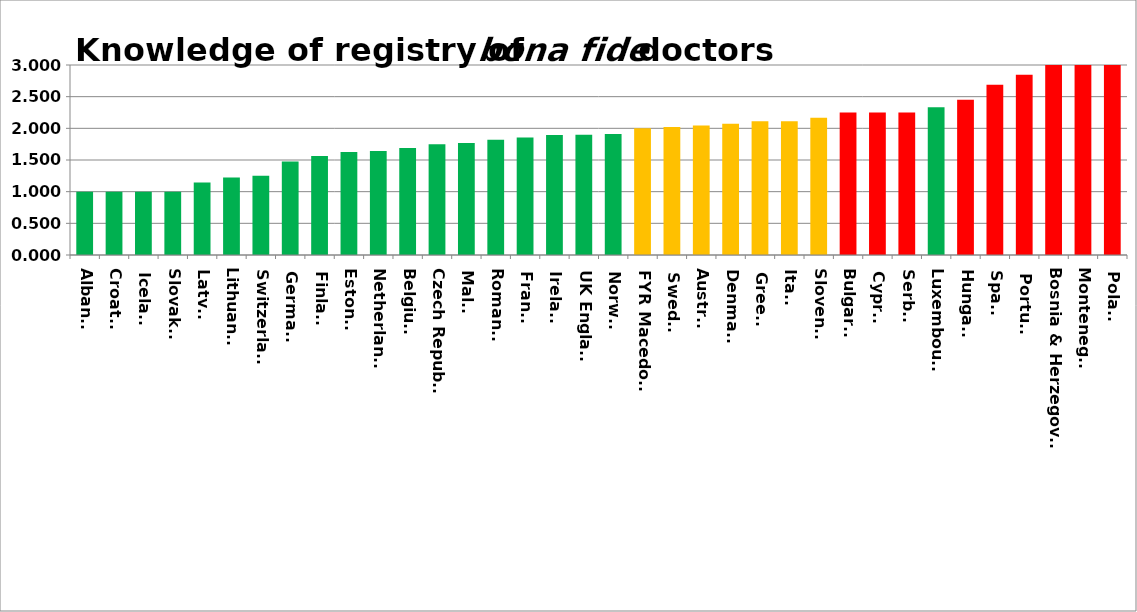
| Category | Series 0 |
|---|---|
| Albania | 1 |
| Croatia | 1 |
| Iceland | 1 |
| Slovakia | 1 |
| Latvia | 1.143 |
| Lithuania | 1.222 |
| Switzerland | 1.25 |
| Germany | 1.478 |
| Finland | 1.564 |
| Estonia | 1.625 |
| Netherlands | 1.643 |
| Belgium | 1.69 |
| Czech Republic | 1.75 |
| Malta | 1.769 |
| Romania | 1.818 |
| France | 1.857 |
| Ireland | 1.893 |
| UK England | 1.9 |
| Norway | 1.909 |
| FYR Macedonia | 2 |
| Sweden | 2.022 |
| Austria | 2.043 |
| Denmark | 2.071 |
| Greece | 2.111 |
| Italy | 2.111 |
| Slovenia | 2.167 |
| Bulgaria | 2.25 |
| Cyprus | 2.25 |
| Serbia | 2.25 |
| Luxembourg | 2.333 |
| Hungary | 2.452 |
| Spain | 2.688 |
| Portugal | 2.846 |
| Bosnia & Herzegovina | 3 |
| Montenegro | 3 |
| Poland | 3 |